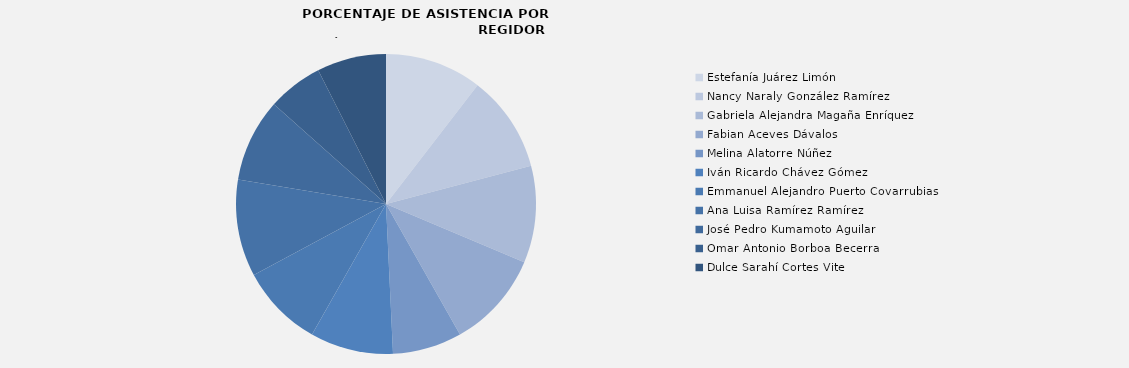
| Category | Estefanía Juárez Limón  |
|---|---|
| Estefanía Juárez Limón  | 100 |
| Nancy Naraly González Ramírez | 100 |
| Gabriela Alejandra Magaña Enríquez | 100 |
| Fabian Aceves Dávalos | 100 |
| Melina Alatorre Núñez | 71.429 |
| Iván Ricardo Chávez Gómez | 85.714 |
| Emmanuel Alejandro Puerto Covarrubias | 85.714 |
| Ana Luisa Ramírez Ramírez | 100 |
| José Pedro Kumamoto Aguilar | 85.714 |
| Omar Antonio Borboa Becerra | 57.143 |
| Dulce Sarahí Cortes Vite | 71.429 |